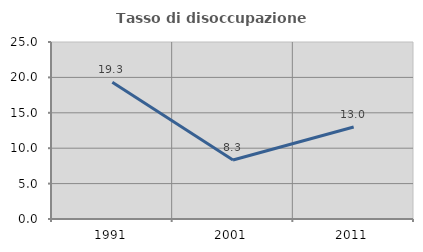
| Category | Tasso di disoccupazione giovanile  |
|---|---|
| 1991.0 | 19.31 |
| 2001.0 | 8.333 |
| 2011.0 | 13 |